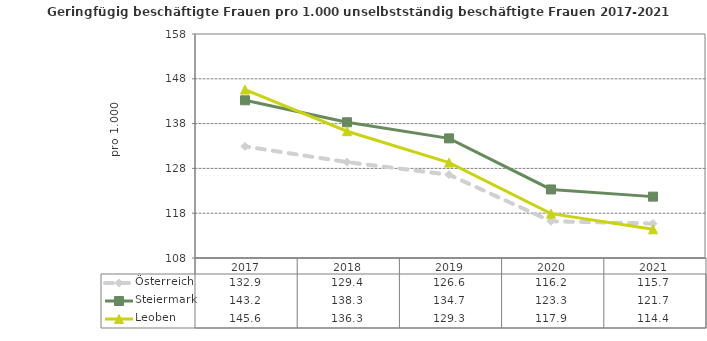
| Category | Österreich | Steiermark | Leoben |
|---|---|---|---|
| 2021.0 | 115.7 | 121.7 | 114.4 |
| 2020.0 | 116.2 | 123.3 | 117.9 |
| 2019.0 | 126.6 | 134.7 | 129.3 |
| 2018.0 | 129.4 | 138.3 | 136.3 |
| 2017.0 | 132.9 | 143.2 | 145.6 |